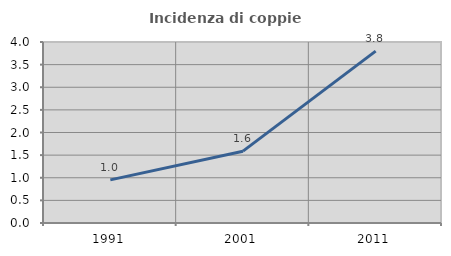
| Category | Incidenza di coppie miste |
|---|---|
| 1991.0 | 0.952 |
| 2001.0 | 1.587 |
| 2011.0 | 3.797 |